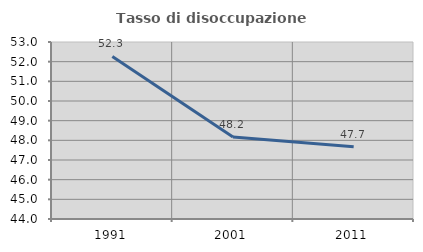
| Category | Tasso di disoccupazione giovanile  |
|---|---|
| 1991.0 | 52.263 |
| 2001.0 | 48.175 |
| 2011.0 | 47.674 |